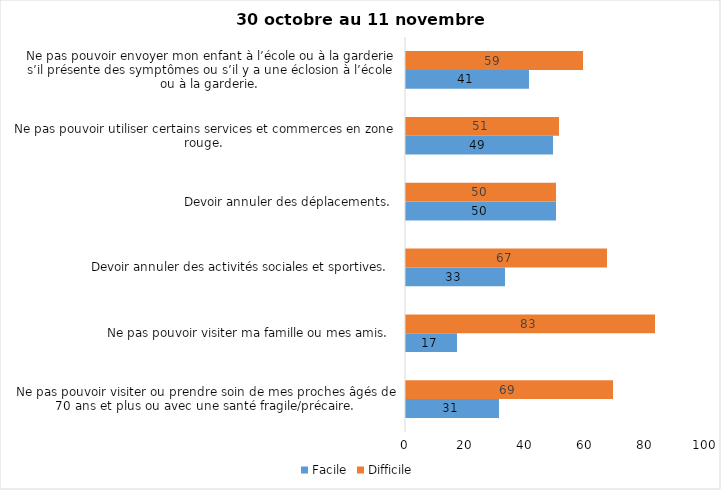
| Category | Facile | Difficile |
|---|---|---|
| Ne pas pouvoir visiter ou prendre soin de mes proches âgés de 70 ans et plus ou avec une santé fragile/précaire.  | 31 | 69 |
| Ne pas pouvoir visiter ma famille ou mes amis.  | 17 | 83 |
| Devoir annuler des activités sociales et sportives.  | 33 | 67 |
| Devoir annuler des déplacements.  | 50 | 50 |
| Ne pas pouvoir utiliser certains services et commerces en zone rouge.  | 49 | 51 |
| Ne pas pouvoir envoyer mon enfant à l’école ou à la garderie s’il présente des symptômes ou s’il y a une éclosion à l’école ou à la garderie.  | 41 | 59 |